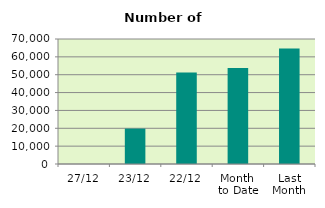
| Category | Series 0 |
|---|---|
| 27/12 | 0 |
| 23/12 | 19838 |
| 22/12 | 51272 |
| Month 
to Date | 53805.412 |
| Last
Month | 64659.273 |